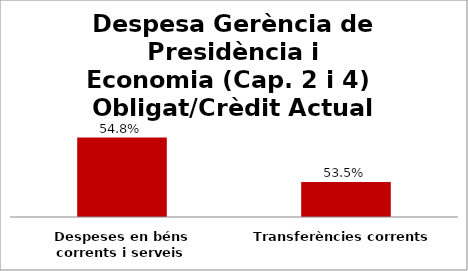
| Category | Series 0 |
|---|---|
| Despeses en béns corrents i serveis | 0.548 |
| Transferències corrents | 0.535 |